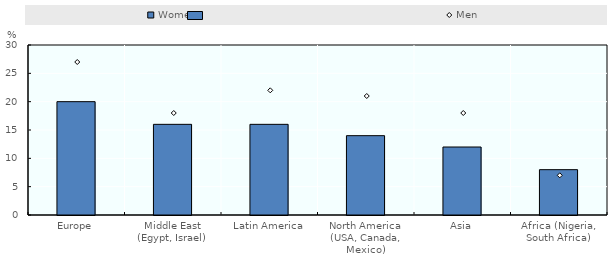
| Category | Women |
|---|---|
| Europe | 20 |
| Middle East (Egypt, Israel) | 16 |
| Latin America | 16 |
| North America (USA, Canada, Mexico) | 14 |
| Asia | 12 |
| Africa (Nigeria, South Africa) | 8 |